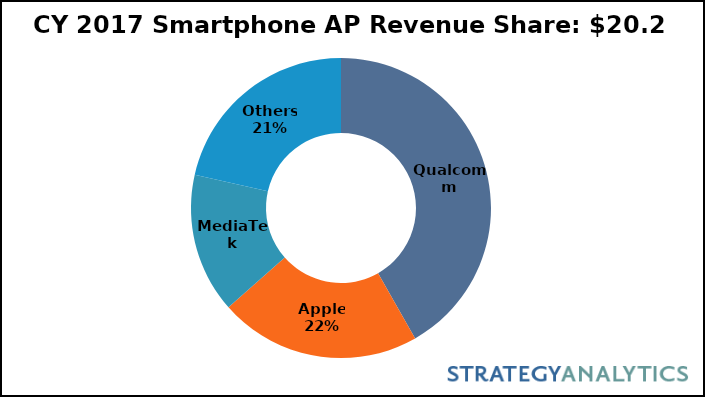
| Category | Revenue Share (%) |
|---|---|
| Qualcomm | 0.418 |
| Apple | 0.217 |
| MediaTek | 0.151 |
| Others | 0.214 |